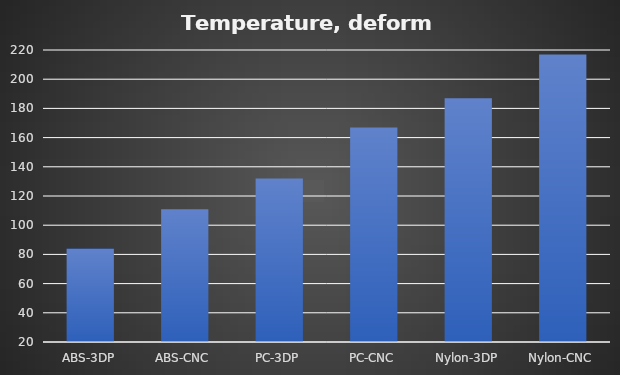
| Category | Deform °C |
|---|---|
| ABS-3DP | 84 |
| ABS-CNC | 111 |
| PC-3DP | 132 |
| PC-CNC | 167 |
| Nylon-3DP | 187 |
| Nylon-CNC | 217 |